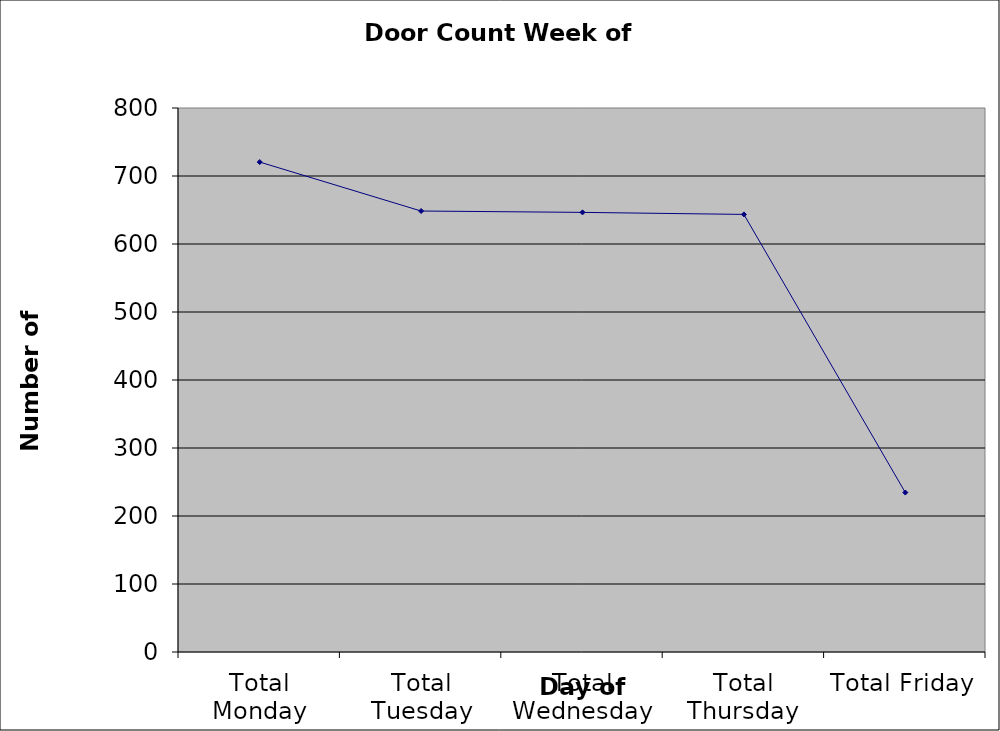
| Category | Series 0 |
|---|---|
| Total Monday | 720.5 |
| Total Tuesday | 648.5 |
| Total Wednesday | 646.5 |
| Total Thursday | 643.5 |
| Total Friday | 234.5 |